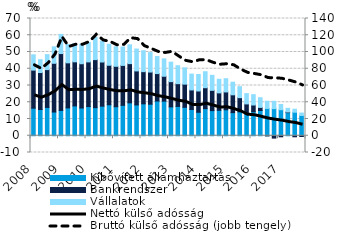
| Category | Kibővített államháztartás | Bankrendszer | Vállalatok |
|---|---|---|---|
| 2008.0 | 16.458 | 22.717 | 9.14 |
| 2008.0 | 15.678 | 22.055 | 7.675 |
| 2008.0 | 16.911 | 22.584 | 8.93 |
| 2008.0 | 14.165 | 29.091 | 9.81 |
| 2009.0 | 15.12 | 33.952 | 11.428 |
| 2009.0 | 16.633 | 26.901 | 10.915 |
| 2009.0 | 17.803 | 26.337 | 10.762 |
| 2009.0 | 16.57 | 26.423 | 11.68 |
| 2010.0 | 17.44 | 26.648 | 11.56 |
| 2010.0 | 16.789 | 28.67 | 13.269 |
| 2010.0 | 17.654 | 26.372 | 12.438 |
| 2010.0 | 18.488 | 23.599 | 12.53 |
| 2011.0 | 17.326 | 24.136 | 11.631 |
| 2011.0 | 18.16 | 23.834 | 10.999 |
| 2011.0 | 19.654 | 23.412 | 11.221 |
| 2011.0 | 18.396 | 20.305 | 13.058 |
| 2012.0 | 19.065 | 19.204 | 12.504 |
| 2012.0 | 18.824 | 19.213 | 11.61 |
| 2012.0 | 20.746 | 16.378 | 10.159 |
| 2012.0 | 20.671 | 14.844 | 10.407 |
| 2013.0 | 17.237 | 15.065 | 11.622 |
| 2013.0 | 17.514 | 13.574 | 10.72 |
| 2013.0 | 16.981 | 13.818 | 9.731 |
| 2013.0 | 15.691 | 11.651 | 9.472 |
| 2014.0 | 14.036 | 12.686 | 9.85 |
| 2014.0 | 16.184 | 12.491 | 9.552 |
| 2014.0 | 15.007 | 12.102 | 8.952 |
| 2014.0 | 15.185 | 10.409 | 8.114 |
| 2015.0 | 15.517 | 10.639 | 7.886 |
| 2015.0 | 13.799 | 10.641 | 7.534 |
| 2015.0 | 14.281 | 8.468 | 6.565 |
| 2015.0 | 13.228 | 5.779 | 6.14 |
| 2016.0 | 14.317 | 4.04 | 6.154 |
| 2016.0 | 15.082 | 1.844 | 5.758 |
| 2016.0 | 16.322 | -0.085 | 4.28 |
| 2016.0 | 16.18 | -1.412 | 4.388 |
| 2017.0 | 15.523 | -0.633 | 3.157 |
| 2017.0 | 13.807 | 0.353 | 2.217 |
| 2017.0 | 14.058 | -0.619 | 1.788 |
| 2017.0 | 12.073 | -0.443 | 1.49 |